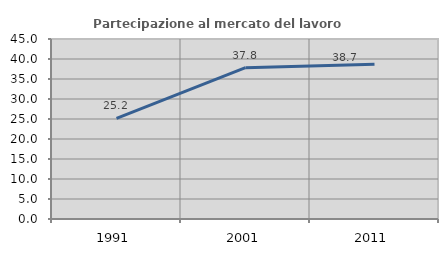
| Category | Partecipazione al mercato del lavoro  femminile |
|---|---|
| 1991.0 | 25.157 |
| 2001.0 | 37.838 |
| 2011.0 | 38.686 |